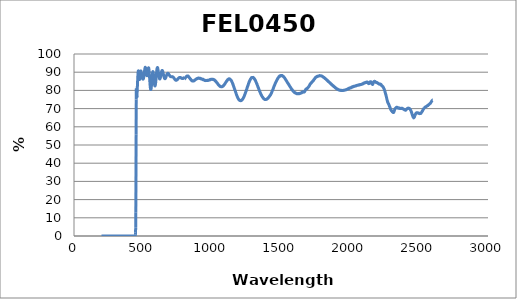
| Category | Series 0 |
|---|---|
| 2600.0 | 74.755 |
| 2599.0 | 74.749 |
| 2598.0 | 74.656 |
| 2597.0 | 74.498 |
| 2596.0 | 74.406 |
| 2595.0 | 74.374 |
| 2594.0 | 74.264 |
| 2593.0 | 74.176 |
| 2592.0 | 74.083 |
| 2591.0 | 73.98 |
| 2590.0 | 73.854 |
| 2589.0 | 73.661 |
| 2588.0 | 73.593 |
| 2587.0 | 73.488 |
| 2586.0 | 73.321 |
| 2585.0 | 73.196 |
| 2584.0 | 73.082 |
| 2583.0 | 72.942 |
| 2582.0 | 72.922 |
| 2581.0 | 72.822 |
| 2580.0 | 72.795 |
| 2579.0 | 72.671 |
| 2578.0 | 72.622 |
| 2577.0 | 72.607 |
| 2576.0 | 72.594 |
| 2575.0 | 72.407 |
| 2574.0 | 72.272 |
| 2573.0 | 72.362 |
| 2572.0 | 72.276 |
| 2571.0 | 72.215 |
| 2570.0 | 72.152 |
| 2569.0 | 72.054 |
| 2568.0 | 72.061 |
| 2567.0 | 71.957 |
| 2566.0 | 71.931 |
| 2565.0 | 71.707 |
| 2564.0 | 71.694 |
| 2563.0 | 71.696 |
| 2562.0 | 71.707 |
| 2561.0 | 71.598 |
| 2560.0 | 71.511 |
| 2559.0 | 71.585 |
| 2558.0 | 71.413 |
| 2557.0 | 71.343 |
| 2556.0 | 71.353 |
| 2555.0 | 71.277 |
| 2554.0 | 71.25 |
| 2553.0 | 71.181 |
| 2552.0 | 71.079 |
| 2551.0 | 70.973 |
| 2550.0 | 71.047 |
| 2549.0 | 70.967 |
| 2548.0 | 70.979 |
| 2547.0 | 70.916 |
| 2546.0 | 70.908 |
| 2545.0 | 70.795 |
| 2544.0 | 70.799 |
| 2543.0 | 70.642 |
| 2542.0 | 70.679 |
| 2541.0 | 70.577 |
| 2540.0 | 70.529 |
| 2539.0 | 70.413 |
| 2538.0 | 70.341 |
| 2537.0 | 70.189 |
| 2536.0 | 70.205 |
| 2535.0 | 69.985 |
| 2534.0 | 69.978 |
| 2533.0 | 69.738 |
| 2532.0 | 69.756 |
| 2531.0 | 69.515 |
| 2530.0 | 69.481 |
| 2529.0 | 69.311 |
| 2528.0 | 69.118 |
| 2527.0 | 68.999 |
| 2526.0 | 68.965 |
| 2525.0 | 68.724 |
| 2524.0 | 68.548 |
| 2523.0 | 68.515 |
| 2522.0 | 68.395 |
| 2521.0 | 68.179 |
| 2520.0 | 68.115 |
| 2519.0 | 67.998 |
| 2518.0 | 67.899 |
| 2517.0 | 67.712 |
| 2516.0 | 67.628 |
| 2515.0 | 67.537 |
| 2514.0 | 67.358 |
| 2513.0 | 67.433 |
| 2512.0 | 67.392 |
| 2511.0 | 67.32 |
| 2510.0 | 67.337 |
| 2509.0 | 67.252 |
| 2508.0 | 67.271 |
| 2507.0 | 67.277 |
| 2506.0 | 67.288 |
| 2505.0 | 67.379 |
| 2504.0 | 67.322 |
| 2503.0 | 67.26 |
| 2502.0 | 67.429 |
| 2501.0 | 67.272 |
| 2500.0 | 67.383 |
| 2499.0 | 67.527 |
| 2498.0 | 67.508 |
| 2497.0 | 67.52 |
| 2496.0 | 67.495 |
| 2495.0 | 67.543 |
| 2494.0 | 67.595 |
| 2493.0 | 67.564 |
| 2492.0 | 67.623 |
| 2491.0 | 67.637 |
| 2490.0 | 67.641 |
| 2489.0 | 67.749 |
| 2488.0 | 67.63 |
| 2487.0 | 67.627 |
| 2486.0 | 67.747 |
| 2485.0 | 67.633 |
| 2484.0 | 67.693 |
| 2483.0 | 67.718 |
| 2482.0 | 67.646 |
| 2481.0 | 67.661 |
| 2480.0 | 67.512 |
| 2479.0 | 67.44 |
| 2478.0 | 67.452 |
| 2477.0 | 67.17 |
| 2476.0 | 67.155 |
| 2475.0 | 66.958 |
| 2474.0 | 66.815 |
| 2473.0 | 66.7 |
| 2472.0 | 66.377 |
| 2471.0 | 66.359 |
| 2470.0 | 66.09 |
| 2469.0 | 65.917 |
| 2468.0 | 65.717 |
| 2467.0 | 65.388 |
| 2466.0 | 65.371 |
| 2465.0 | 65.183 |
| 2464.0 | 65.081 |
| 2463.0 | 65.059 |
| 2462.0 | 64.901 |
| 2461.0 | 64.993 |
| 2460.0 | 65.054 |
| 2459.0 | 65.156 |
| 2458.0 | 65.309 |
| 2457.0 | 65.414 |
| 2456.0 | 65.635 |
| 2455.0 | 65.851 |
| 2454.0 | 66.177 |
| 2453.0 | 66.309 |
| 2452.0 | 66.484 |
| 2451.0 | 66.699 |
| 2450.0 | 66.995 |
| 2449.0 | 67.122 |
| 2448.0 | 67.424 |
| 2447.0 | 67.72 |
| 2446.0 | 67.884 |
| 2445.0 | 68.169 |
| 2444.0 | 68.295 |
| 2443.0 | 68.603 |
| 2442.0 | 68.752 |
| 2441.0 | 69 |
| 2440.0 | 69.061 |
| 2439.0 | 69.208 |
| 2438.0 | 69.479 |
| 2437.0 | 69.523 |
| 2436.0 | 69.595 |
| 2435.0 | 69.714 |
| 2434.0 | 69.813 |
| 2433.0 | 69.838 |
| 2432.0 | 69.91 |
| 2431.0 | 70.049 |
| 2430.0 | 69.981 |
| 2429.0 | 70.113 |
| 2428.0 | 70.085 |
| 2427.0 | 70.196 |
| 2426.0 | 70.203 |
| 2425.0 | 70.263 |
| 2424.0 | 70.181 |
| 2423.0 | 70.242 |
| 2422.0 | 70.233 |
| 2421.0 | 70.258 |
| 2420.0 | 70.14 |
| 2419.0 | 70.237 |
| 2418.0 | 70.066 |
| 2417.0 | 70.086 |
| 2416.0 | 70.098 |
| 2415.0 | 69.969 |
| 2414.0 | 69.97 |
| 2413.0 | 69.926 |
| 2412.0 | 69.81 |
| 2411.0 | 69.734 |
| 2410.0 | 69.654 |
| 2409.0 | 69.625 |
| 2408.0 | 69.449 |
| 2407.0 | 69.462 |
| 2406.0 | 69.37 |
| 2405.0 | 69.187 |
| 2404.0 | 69.303 |
| 2403.0 | 69.095 |
| 2402.0 | 69.138 |
| 2401.0 | 69.136 |
| 2400.0 | 69.183 |
| 2399.0 | 69.25 |
| 2398.0 | 69.204 |
| 2397.0 | 69.389 |
| 2396.0 | 69.257 |
| 2395.0 | 69.421 |
| 2394.0 | 69.44 |
| 2393.0 | 69.432 |
| 2392.0 | 69.527 |
| 2391.0 | 69.543 |
| 2390.0 | 69.649 |
| 2389.0 | 69.65 |
| 2388.0 | 69.686 |
| 2387.0 | 69.682 |
| 2386.0 | 69.8 |
| 2385.0 | 69.857 |
| 2384.0 | 69.889 |
| 2383.0 | 69.938 |
| 2382.0 | 70.007 |
| 2381.0 | 70.028 |
| 2380.0 | 70.108 |
| 2379.0 | 70.104 |
| 2378.0 | 70.188 |
| 2377.0 | 70.172 |
| 2376.0 | 70.09 |
| 2375.0 | 70.108 |
| 2374.0 | 70.027 |
| 2373.0 | 70.086 |
| 2372.0 | 70.003 |
| 2371.0 | 70.128 |
| 2370.0 | 70.163 |
| 2369.0 | 70.093 |
| 2368.0 | 70.018 |
| 2367.0 | 69.994 |
| 2366.0 | 69.993 |
| 2365.0 | 69.988 |
| 2364.0 | 70.051 |
| 2363.0 | 70.045 |
| 2362.0 | 70.106 |
| 2361.0 | 70.18 |
| 2360.0 | 70.111 |
| 2359.0 | 70.311 |
| 2358.0 | 70.205 |
| 2357.0 | 70.284 |
| 2356.0 | 70.367 |
| 2355.0 | 70.283 |
| 2354.0 | 70.221 |
| 2353.0 | 70.174 |
| 2352.0 | 70.301 |
| 2351.0 | 70.194 |
| 2350.0 | 70.396 |
| 2349.0 | 70.335 |
| 2348.0 | 70.282 |
| 2347.0 | 70.538 |
| 2346.0 | 70.404 |
| 2345.0 | 70.471 |
| 2344.0 | 70.54 |
| 2343.0 | 70.521 |
| 2342.0 | 70.631 |
| 2341.0 | 70.717 |
| 2340.0 | 70.714 |
| 2339.0 | 70.717 |
| 2338.0 | 70.743 |
| 2337.0 | 70.621 |
| 2336.0 | 70.701 |
| 2335.0 | 70.615 |
| 2334.0 | 70.543 |
| 2333.0 | 70.448 |
| 2332.0 | 70.323 |
| 2331.0 | 70.313 |
| 2330.0 | 70.232 |
| 2329.0 | 70.186 |
| 2328.0 | 70.142 |
| 2327.0 | 69.962 |
| 2326.0 | 69.741 |
| 2325.0 | 69.664 |
| 2324.0 | 69.445 |
| 2323.0 | 69.228 |
| 2322.0 | 69.102 |
| 2321.0 | 68.815 |
| 2320.0 | 68.695 |
| 2319.0 | 68.382 |
| 2318.0 | 68.164 |
| 2317.0 | 68.036 |
| 2316.0 | 67.858 |
| 2315.0 | 67.826 |
| 2314.0 | 67.835 |
| 2313.0 | 67.855 |
| 2312.0 | 67.899 |
| 2311.0 | 68.007 |
| 2310.0 | 68.085 |
| 2309.0 | 68.106 |
| 2308.0 | 68.243 |
| 2307.0 | 68.299 |
| 2306.0 | 68.287 |
| 2305.0 | 68.501 |
| 2304.0 | 68.537 |
| 2303.0 | 68.743 |
| 2302.0 | 68.66 |
| 2301.0 | 68.807 |
| 2300.0 | 68.859 |
| 2299.0 | 69.02 |
| 2298.0 | 69.212 |
| 2297.0 | 69.233 |
| 2296.0 | 69.418 |
| 2295.0 | 69.637 |
| 2294.0 | 69.842 |
| 2293.0 | 69.965 |
| 2292.0 | 70.185 |
| 2291.0 | 70.348 |
| 2290.0 | 70.681 |
| 2289.0 | 70.741 |
| 2288.0 | 70.956 |
| 2287.0 | 71.094 |
| 2286.0 | 71.269 |
| 2285.0 | 71.465 |
| 2284.0 | 71.776 |
| 2283.0 | 72.001 |
| 2282.0 | 72.129 |
| 2281.0 | 72.236 |
| 2280.0 | 72.541 |
| 2279.0 | 72.664 |
| 2278.0 | 72.782 |
| 2277.0 | 72.884 |
| 2276.0 | 73.109 |
| 2275.0 | 73.233 |
| 2274.0 | 73.336 |
| 2273.0 | 73.638 |
| 2272.0 | 73.79 |
| 2271.0 | 74.15 |
| 2270.0 | 74.355 |
| 2269.0 | 74.669 |
| 2268.0 | 74.959 |
| 2267.0 | 75.339 |
| 2266.0 | 75.659 |
| 2265.0 | 76.037 |
| 2264.0 | 76.254 |
| 2263.0 | 76.634 |
| 2262.0 | 76.865 |
| 2261.0 | 77.267 |
| 2260.0 | 77.59 |
| 2259.0 | 77.757 |
| 2258.0 | 78.043 |
| 2257.0 | 78.349 |
| 2256.0 | 78.631 |
| 2255.0 | 78.95 |
| 2254.0 | 79.125 |
| 2253.0 | 79.475 |
| 2252.0 | 79.814 |
| 2251.0 | 79.901 |
| 2250.0 | 80.174 |
| 2249.0 | 80.365 |
| 2248.0 | 80.627 |
| 2247.0 | 80.784 |
| 2246.0 | 81.003 |
| 2245.0 | 81.081 |
| 2244.0 | 81.311 |
| 2243.0 | 81.445 |
| 2242.0 | 81.663 |
| 2241.0 | 81.74 |
| 2240.0 | 81.759 |
| 2239.0 | 81.923 |
| 2238.0 | 82.071 |
| 2237.0 | 82.157 |
| 2236.0 | 82.243 |
| 2235.0 | 82.302 |
| 2234.0 | 82.352 |
| 2233.0 | 82.372 |
| 2232.0 | 82.486 |
| 2231.0 | 82.595 |
| 2230.0 | 82.629 |
| 2229.0 | 82.601 |
| 2228.0 | 82.881 |
| 2227.0 | 83.037 |
| 2226.0 | 83.019 |
| 2225.0 | 83.121 |
| 2224.0 | 83.245 |
| 2223.0 | 83.341 |
| 2222.0 | 83.322 |
| 2221.0 | 83.265 |
| 2220.0 | 83.471 |
| 2219.0 | 83.512 |
| 2218.0 | 83.517 |
| 2217.0 | 83.585 |
| 2216.0 | 83.54 |
| 2215.0 | 83.459 |
| 2214.0 | 83.494 |
| 2213.0 | 83.494 |
| 2212.0 | 83.431 |
| 2211.0 | 83.551 |
| 2210.0 | 83.561 |
| 2209.0 | 83.532 |
| 2208.0 | 83.726 |
| 2207.0 | 83.625 |
| 2206.0 | 83.779 |
| 2205.0 | 83.708 |
| 2204.0 | 83.843 |
| 2203.0 | 83.839 |
| 2202.0 | 83.952 |
| 2201.0 | 83.959 |
| 2200.0 | 84.105 |
| 2199.0 | 84.125 |
| 2198.0 | 84.137 |
| 2197.0 | 84.186 |
| 2196.0 | 84.29 |
| 2195.0 | 84.337 |
| 2194.0 | 84.29 |
| 2193.0 | 84.339 |
| 2192.0 | 84.335 |
| 2191.0 | 84.457 |
| 2190.0 | 84.315 |
| 2189.0 | 84.433 |
| 2188.0 | 84.471 |
| 2187.0 | 84.555 |
| 2186.0 | 84.612 |
| 2185.0 | 84.621 |
| 2184.0 | 84.708 |
| 2183.0 | 84.813 |
| 2182.0 | 84.899 |
| 2181.0 | 84.837 |
| 2180.0 | 84.827 |
| 2179.0 | 84.921 |
| 2178.0 | 84.823 |
| 2177.0 | 85.047 |
| 2176.0 | 84.836 |
| 2175.0 | 84.84 |
| 2174.0 | 84.827 |
| 2173.0 | 84.818 |
| 2172.0 | 84.575 |
| 2171.0 | 84.485 |
| 2170.0 | 84.274 |
| 2169.0 | 84.099 |
| 2168.0 | 83.915 |
| 2167.0 | 83.815 |
| 2166.0 | 83.557 |
| 2165.0 | 83.455 |
| 2164.0 | 83.278 |
| 2163.0 | 83.305 |
| 2162.0 | 83.351 |
| 2161.0 | 83.425 |
| 2160.0 | 83.529 |
| 2159.0 | 83.554 |
| 2158.0 | 83.771 |
| 2157.0 | 83.87 |
| 2156.0 | 84.071 |
| 2155.0 | 84.295 |
| 2154.0 | 84.494 |
| 2153.0 | 84.502 |
| 2152.0 | 84.582 |
| 2151.0 | 84.578 |
| 2150.0 | 84.79 |
| 2149.0 | 84.702 |
| 2148.0 | 84.785 |
| 2147.0 | 84.75 |
| 2146.0 | 84.661 |
| 2145.0 | 84.52 |
| 2144.0 | 84.465 |
| 2143.0 | 84.531 |
| 2142.0 | 84.253 |
| 2141.0 | 84.13 |
| 2140.0 | 84.026 |
| 2139.0 | 83.894 |
| 2138.0 | 83.887 |
| 2137.0 | 83.731 |
| 2136.0 | 83.744 |
| 2135.0 | 83.712 |
| 2134.0 | 83.795 |
| 2133.0 | 83.803 |
| 2132.0 | 83.907 |
| 2131.0 | 84.041 |
| 2130.0 | 84.076 |
| 2129.0 | 84.18 |
| 2128.0 | 84.284 |
| 2127.0 | 84.287 |
| 2126.0 | 84.484 |
| 2125.0 | 84.62 |
| 2124.0 | 84.526 |
| 2123.0 | 84.461 |
| 2122.0 | 84.513 |
| 2121.0 | 84.593 |
| 2120.0 | 84.555 |
| 2119.0 | 84.378 |
| 2118.0 | 84.495 |
| 2117.0 | 84.422 |
| 2116.0 | 84.381 |
| 2115.0 | 84.437 |
| 2114.0 | 84.364 |
| 2113.0 | 84.407 |
| 2112.0 | 84.314 |
| 2111.0 | 84.229 |
| 2110.0 | 84.236 |
| 2109.0 | 84.193 |
| 2108.0 | 84.284 |
| 2107.0 | 84.175 |
| 2106.0 | 84.075 |
| 2105.0 | 84.096 |
| 2104.0 | 84.132 |
| 2103.0 | 84.06 |
| 2102.0 | 83.977 |
| 2101.0 | 84.093 |
| 2100.0 | 83.89 |
| 2099.0 | 83.878 |
| 2098.0 | 83.964 |
| 2097.0 | 83.722 |
| 2096.0 | 83.781 |
| 2095.0 | 83.788 |
| 2094.0 | 83.732 |
| 2093.0 | 83.574 |
| 2092.0 | 83.59 |
| 2091.0 | 83.563 |
| 2090.0 | 83.555 |
| 2089.0 | 83.582 |
| 2088.0 | 83.466 |
| 2087.0 | 83.507 |
| 2086.0 | 83.434 |
| 2085.0 | 83.395 |
| 2084.0 | 83.309 |
| 2083.0 | 83.335 |
| 2082.0 | 83.265 |
| 2081.0 | 83.278 |
| 2080.0 | 83.26 |
| 2079.0 | 83.201 |
| 2078.0 | 83.278 |
| 2077.0 | 83.171 |
| 2076.0 | 83.145 |
| 2075.0 | 83.156 |
| 2074.0 | 83.195 |
| 2073.0 | 83.197 |
| 2072.0 | 83.198 |
| 2071.0 | 83.089 |
| 2070.0 | 83.157 |
| 2069.0 | 83.001 |
| 2068.0 | 82.968 |
| 2067.0 | 83.061 |
| 2066.0 | 82.968 |
| 2065.0 | 83.066 |
| 2064.0 | 83.009 |
| 2063.0 | 83.025 |
| 2062.0 | 82.908 |
| 2061.0 | 82.932 |
| 2060.0 | 82.871 |
| 2059.0 | 82.899 |
| 2058.0 | 82.917 |
| 2057.0 | 82.896 |
| 2056.0 | 82.829 |
| 2055.0 | 82.783 |
| 2054.0 | 82.82 |
| 2053.0 | 82.753 |
| 2052.0 | 82.732 |
| 2051.0 | 82.768 |
| 2050.0 | 82.693 |
| 2049.0 | 82.608 |
| 2048.0 | 82.687 |
| 2047.0 | 82.68 |
| 2046.0 | 82.623 |
| 2045.0 | 82.517 |
| 2044.0 | 82.481 |
| 2043.0 | 82.551 |
| 2042.0 | 82.571 |
| 2041.0 | 82.606 |
| 2040.0 | 82.539 |
| 2039.0 | 82.399 |
| 2038.0 | 82.395 |
| 2037.0 | 82.437 |
| 2036.0 | 82.381 |
| 2035.0 | 82.342 |
| 2034.0 | 82.353 |
| 2033.0 | 82.329 |
| 2032.0 | 82.222 |
| 2031.0 | 82.243 |
| 2030.0 | 82.211 |
| 2029.0 | 82.18 |
| 2028.0 | 82.285 |
| 2027.0 | 82.192 |
| 2026.0 | 82.113 |
| 2025.0 | 82.231 |
| 2024.0 | 82.118 |
| 2023.0 | 82.048 |
| 2022.0 | 81.983 |
| 2021.0 | 81.987 |
| 2020.0 | 81.879 |
| 2019.0 | 81.987 |
| 2018.0 | 81.972 |
| 2017.0 | 81.773 |
| 2016.0 | 81.942 |
| 2015.0 | 81.796 |
| 2014.0 | 81.735 |
| 2013.0 | 81.81 |
| 2012.0 | 81.741 |
| 2011.0 | 81.752 |
| 2010.0 | 81.627 |
| 2009.0 | 81.664 |
| 2008.0 | 81.467 |
| 2007.0 | 81.562 |
| 2006.0 | 81.518 |
| 2005.0 | 81.442 |
| 2004.0 | 81.493 |
| 2003.0 | 81.448 |
| 2002.0 | 81.404 |
| 2001.0 | 81.37 |
| 2000.0 | 81.348 |
| 1999.0 | 81.201 |
| 1998.0 | 81.298 |
| 1997.0 | 81.306 |
| 1996.0 | 81.171 |
| 1995.0 | 81.073 |
| 1994.0 | 81.152 |
| 1993.0 | 81.23 |
| 1992.0 | 81.087 |
| 1991.0 | 81.121 |
| 1990.0 | 81.1 |
| 1989.0 | 80.907 |
| 1988.0 | 80.917 |
| 1987.0 | 80.968 |
| 1986.0 | 80.82 |
| 1985.0 | 80.872 |
| 1984.0 | 80.853 |
| 1983.0 | 80.736 |
| 1982.0 | 80.655 |
| 1981.0 | 80.652 |
| 1980.0 | 80.658 |
| 1979.0 | 80.609 |
| 1978.0 | 80.531 |
| 1977.0 | 80.59 |
| 1976.0 | 80.463 |
| 1975.0 | 80.538 |
| 1974.0 | 80.547 |
| 1973.0 | 80.439 |
| 1972.0 | 80.399 |
| 1971.0 | 80.41 |
| 1970.0 | 80.387 |
| 1969.0 | 80.242 |
| 1968.0 | 80.285 |
| 1967.0 | 80.28 |
| 1966.0 | 80.285 |
| 1965.0 | 80.231 |
| 1964.0 | 80.243 |
| 1963.0 | 80.163 |
| 1962.0 | 80.186 |
| 1961.0 | 80.144 |
| 1960.0 | 80.072 |
| 1959.0 | 80.12 |
| 1958.0 | 80.118 |
| 1957.0 | 80.086 |
| 1956.0 | 80.051 |
| 1955.0 | 80.099 |
| 1954.0 | 79.985 |
| 1953.0 | 80.094 |
| 1952.0 | 79.963 |
| 1951.0 | 80.029 |
| 1950.0 | 79.969 |
| 1949.0 | 79.943 |
| 1948.0 | 79.947 |
| 1947.0 | 79.958 |
| 1946.0 | 79.944 |
| 1945.0 | 80.031 |
| 1944.0 | 79.946 |
| 1943.0 | 80.01 |
| 1942.0 | 79.943 |
| 1941.0 | 79.979 |
| 1940.0 | 79.96 |
| 1939.0 | 79.967 |
| 1938.0 | 80.018 |
| 1937.0 | 80.064 |
| 1936.0 | 80 |
| 1935.0 | 79.975 |
| 1934.0 | 79.9 |
| 1933.0 | 80.013 |
| 1932.0 | 79.995 |
| 1931.0 | 80.012 |
| 1930.0 | 80.043 |
| 1929.0 | 80.053 |
| 1928.0 | 80.109 |
| 1927.0 | 80.167 |
| 1926.0 | 80.091 |
| 1925.0 | 80.172 |
| 1924.0 | 80.231 |
| 1923.0 | 80.164 |
| 1922.0 | 80.14 |
| 1921.0 | 80.198 |
| 1920.0 | 80.261 |
| 1919.0 | 80.3 |
| 1918.0 | 80.27 |
| 1917.0 | 80.362 |
| 1916.0 | 80.417 |
| 1915.0 | 80.421 |
| 1914.0 | 80.446 |
| 1913.0 | 80.481 |
| 1912.0 | 80.472 |
| 1911.0 | 80.713 |
| 1910.0 | 80.641 |
| 1909.0 | 80.691 |
| 1908.0 | 80.74 |
| 1907.0 | 80.695 |
| 1906.0 | 80.766 |
| 1905.0 | 80.933 |
| 1904.0 | 80.853 |
| 1903.0 | 80.998 |
| 1902.0 | 80.937 |
| 1901.0 | 81.012 |
| 1900.0 | 81.122 |
| 1899.0 | 81.075 |
| 1898.0 | 81.193 |
| 1897.0 | 81.362 |
| 1896.0 | 81.402 |
| 1895.0 | 81.456 |
| 1894.0 | 81.398 |
| 1893.0 | 81.572 |
| 1892.0 | 81.49 |
| 1891.0 | 81.718 |
| 1890.0 | 81.808 |
| 1889.0 | 81.878 |
| 1888.0 | 81.839 |
| 1887.0 | 81.951 |
| 1886.0 | 81.959 |
| 1885.0 | 82.034 |
| 1884.0 | 82.022 |
| 1883.0 | 82.2 |
| 1882.0 | 82.367 |
| 1881.0 | 82.283 |
| 1880.0 | 82.363 |
| 1879.0 | 82.374 |
| 1878.0 | 82.445 |
| 1877.0 | 82.581 |
| 1876.0 | 82.713 |
| 1875.0 | 82.696 |
| 1874.0 | 82.766 |
| 1873.0 | 82.823 |
| 1872.0 | 82.867 |
| 1871.0 | 82.881 |
| 1870.0 | 83.117 |
| 1869.0 | 83.086 |
| 1868.0 | 83.201 |
| 1867.0 | 83.202 |
| 1866.0 | 83.415 |
| 1865.0 | 83.463 |
| 1864.0 | 83.373 |
| 1863.0 | 83.53 |
| 1862.0 | 83.577 |
| 1861.0 | 83.592 |
| 1860.0 | 83.665 |
| 1859.0 | 83.872 |
| 1858.0 | 83.9 |
| 1857.0 | 84.018 |
| 1856.0 | 84.128 |
| 1855.0 | 84.049 |
| 1854.0 | 84.145 |
| 1853.0 | 84.211 |
| 1852.0 | 84.329 |
| 1851.0 | 84.425 |
| 1850.0 | 84.41 |
| 1849.0 | 84.577 |
| 1848.0 | 84.533 |
| 1847.0 | 84.609 |
| 1846.0 | 84.75 |
| 1845.0 | 84.806 |
| 1844.0 | 84.871 |
| 1843.0 | 84.822 |
| 1842.0 | 84.966 |
| 1841.0 | 84.96 |
| 1840.0 | 85.194 |
| 1839.0 | 85.192 |
| 1838.0 | 85.293 |
| 1837.0 | 85.507 |
| 1836.0 | 85.416 |
| 1835.0 | 85.566 |
| 1834.0 | 85.606 |
| 1833.0 | 85.631 |
| 1832.0 | 85.735 |
| 1831.0 | 85.742 |
| 1830.0 | 85.946 |
| 1829.0 | 85.901 |
| 1828.0 | 86.043 |
| 1827.0 | 86.026 |
| 1826.0 | 86.11 |
| 1825.0 | 86.217 |
| 1824.0 | 86.315 |
| 1823.0 | 86.416 |
| 1822.0 | 86.331 |
| 1821.0 | 86.49 |
| 1820.0 | 86.554 |
| 1819.0 | 86.662 |
| 1818.0 | 86.697 |
| 1817.0 | 86.675 |
| 1816.0 | 86.852 |
| 1815.0 | 86.828 |
| 1814.0 | 86.869 |
| 1813.0 | 86.979 |
| 1812.0 | 86.99 |
| 1811.0 | 87.052 |
| 1810.0 | 87.183 |
| 1809.0 | 87.197 |
| 1808.0 | 87.261 |
| 1807.0 | 87.341 |
| 1806.0 | 87.42 |
| 1805.0 | 87.432 |
| 1804.0 | 87.384 |
| 1803.0 | 87.475 |
| 1802.0 | 87.586 |
| 1801.0 | 87.584 |
| 1800.0 | 87.746 |
| 1799.0 | 87.712 |
| 1798.0 | 87.781 |
| 1797.0 | 87.845 |
| 1796.0 | 87.801 |
| 1795.0 | 87.86 |
| 1794.0 | 87.939 |
| 1793.0 | 87.869 |
| 1792.0 | 87.936 |
| 1791.0 | 87.979 |
| 1790.0 | 88.037 |
| 1789.0 | 88.043 |
| 1788.0 | 87.984 |
| 1787.0 | 88.052 |
| 1786.0 | 88.069 |
| 1785.0 | 88.048 |
| 1784.0 | 88.093 |
| 1783.0 | 88.059 |
| 1782.0 | 88.073 |
| 1781.0 | 88.114 |
| 1780.0 | 88.151 |
| 1779.0 | 88.13 |
| 1778.0 | 87.996 |
| 1777.0 | 88.011 |
| 1776.0 | 87.931 |
| 1775.0 | 87.889 |
| 1774.0 | 87.839 |
| 1773.0 | 87.899 |
| 1772.0 | 87.925 |
| 1771.0 | 87.911 |
| 1770.0 | 87.82 |
| 1769.0 | 87.847 |
| 1768.0 | 87.76 |
| 1767.0 | 87.779 |
| 1766.0 | 87.819 |
| 1765.0 | 87.78 |
| 1764.0 | 87.758 |
| 1763.0 | 87.646 |
| 1762.0 | 87.747 |
| 1761.0 | 87.616 |
| 1760.0 | 87.484 |
| 1759.0 | 87.56 |
| 1758.0 | 87.525 |
| 1757.0 | 87.462 |
| 1756.0 | 87.358 |
| 1755.0 | 87.385 |
| 1754.0 | 87.33 |
| 1753.0 | 87.306 |
| 1752.0 | 87.251 |
| 1751.0 | 87.095 |
| 1750.0 | 87.009 |
| 1749.0 | 86.95 |
| 1748.0 | 86.866 |
| 1747.0 | 86.803 |
| 1746.0 | 86.607 |
| 1745.0 | 86.522 |
| 1744.0 | 86.384 |
| 1743.0 | 86.414 |
| 1742.0 | 86.274 |
| 1741.0 | 86.157 |
| 1740.0 | 86.04 |
| 1739.0 | 85.968 |
| 1738.0 | 85.847 |
| 1737.0 | 85.676 |
| 1736.0 | 85.651 |
| 1735.0 | 85.576 |
| 1734.0 | 85.313 |
| 1733.0 | 85.321 |
| 1732.0 | 85.268 |
| 1731.0 | 85.223 |
| 1730.0 | 85.05 |
| 1729.0 | 85.026 |
| 1728.0 | 84.816 |
| 1727.0 | 84.814 |
| 1726.0 | 84.701 |
| 1725.0 | 84.615 |
| 1724.0 | 84.555 |
| 1723.0 | 84.454 |
| 1722.0 | 84.48 |
| 1721.0 | 84.228 |
| 1720.0 | 84.202 |
| 1719.0 | 84.051 |
| 1718.0 | 84.068 |
| 1717.0 | 83.886 |
| 1716.0 | 83.738 |
| 1715.0 | 83.759 |
| 1714.0 | 83.76 |
| 1713.0 | 83.596 |
| 1712.0 | 83.489 |
| 1711.0 | 83.405 |
| 1710.0 | 83.272 |
| 1709.0 | 83.097 |
| 1708.0 | 83.005 |
| 1707.0 | 82.77 |
| 1706.0 | 82.725 |
| 1705.0 | 82.577 |
| 1704.0 | 82.439 |
| 1703.0 | 82.274 |
| 1702.0 | 82.176 |
| 1701.0 | 82.1 |
| 1700.0 | 81.962 |
| 1699.0 | 81.837 |
| 1698.0 | 81.763 |
| 1697.0 | 81.646 |
| 1696.0 | 81.691 |
| 1695.0 | 81.537 |
| 1694.0 | 81.536 |
| 1693.0 | 81.417 |
| 1692.0 | 81.311 |
| 1691.0 | 81.124 |
| 1690.0 | 81.198 |
| 1689.0 | 81.017 |
| 1688.0 | 81.032 |
| 1687.0 | 80.847 |
| 1686.0 | 80.879 |
| 1685.0 | 80.937 |
| 1684.0 | 80.833 |
| 1683.0 | 80.683 |
| 1682.0 | 80.737 |
| 1681.0 | 80.643 |
| 1680.0 | 80.642 |
| 1679.0 | 80.411 |
| 1678.0 | 80.305 |
| 1677.0 | 80.22 |
| 1676.0 | 80.086 |
| 1675.0 | 79.897 |
| 1674.0 | 79.751 |
| 1673.0 | 79.569 |
| 1672.0 | 79.523 |
| 1671.0 | 79.266 |
| 1670.0 | 79.178 |
| 1669.0 | 79.096 |
| 1668.0 | 79.117 |
| 1667.0 | 79.111 |
| 1666.0 | 79.079 |
| 1665.0 | 79.047 |
| 1664.0 | 79.152 |
| 1663.0 | 79.128 |
| 1662.0 | 79.274 |
| 1661.0 | 79.189 |
| 1660.0 | 79.164 |
| 1659.0 | 79.177 |
| 1658.0 | 79.104 |
| 1657.0 | 79.106 |
| 1656.0 | 79.093 |
| 1655.0 | 79.071 |
| 1654.0 | 79.082 |
| 1653.0 | 78.929 |
| 1652.0 | 78.917 |
| 1651.0 | 78.786 |
| 1650.0 | 78.714 |
| 1649.0 | 78.574 |
| 1648.0 | 78.636 |
| 1647.0 | 78.631 |
| 1646.0 | 78.588 |
| 1645.0 | 78.525 |
| 1644.0 | 78.495 |
| 1643.0 | 78.57 |
| 1642.0 | 78.54 |
| 1641.0 | 78.516 |
| 1640.0 | 78.497 |
| 1639.0 | 78.376 |
| 1638.0 | 78.291 |
| 1637.0 | 78.359 |
| 1636.0 | 78.327 |
| 1635.0 | 78.22 |
| 1634.0 | 78.257 |
| 1633.0 | 78.259 |
| 1632.0 | 78.207 |
| 1631.0 | 78.25 |
| 1630.0 | 78.277 |
| 1629.0 | 78.182 |
| 1628.0 | 78.217 |
| 1627.0 | 78.304 |
| 1626.0 | 78.13 |
| 1625.0 | 78.235 |
| 1624.0 | 78.154 |
| 1623.0 | 78.176 |
| 1622.0 | 78.167 |
| 1621.0 | 78.128 |
| 1620.0 | 78.244 |
| 1619.0 | 78.175 |
| 1618.0 | 78.144 |
| 1617.0 | 78.196 |
| 1616.0 | 78.239 |
| 1615.0 | 78.25 |
| 1614.0 | 78.213 |
| 1613.0 | 78.35 |
| 1612.0 | 78.284 |
| 1611.0 | 78.341 |
| 1610.0 | 78.417 |
| 1609.0 | 78.464 |
| 1608.0 | 78.478 |
| 1607.0 | 78.549 |
| 1606.0 | 78.468 |
| 1605.0 | 78.524 |
| 1604.0 | 78.557 |
| 1603.0 | 78.613 |
| 1602.0 | 78.693 |
| 1601.0 | 78.706 |
| 1600.0 | 78.836 |
| 1599.0 | 78.86 |
| 1598.0 | 78.951 |
| 1597.0 | 78.886 |
| 1596.0 | 79.094 |
| 1595.0 | 79.156 |
| 1594.0 | 79.192 |
| 1593.0 | 79.166 |
| 1592.0 | 79.374 |
| 1591.0 | 79.392 |
| 1590.0 | 79.488 |
| 1589.0 | 79.561 |
| 1588.0 | 79.678 |
| 1587.0 | 79.689 |
| 1586.0 | 79.766 |
| 1585.0 | 79.913 |
| 1584.0 | 80.05 |
| 1583.0 | 80.053 |
| 1582.0 | 80.127 |
| 1581.0 | 80.378 |
| 1580.0 | 80.386 |
| 1579.0 | 80.503 |
| 1578.0 | 80.594 |
| 1577.0 | 80.696 |
| 1576.0 | 80.829 |
| 1575.0 | 80.86 |
| 1574.0 | 81.058 |
| 1573.0 | 81.187 |
| 1572.0 | 81.295 |
| 1571.0 | 81.463 |
| 1570.0 | 81.543 |
| 1569.0 | 81.694 |
| 1568.0 | 81.776 |
| 1567.0 | 81.932 |
| 1566.0 | 82.025 |
| 1565.0 | 82.196 |
| 1564.0 | 82.184 |
| 1563.0 | 82.374 |
| 1562.0 | 82.473 |
| 1561.0 | 82.549 |
| 1560.0 | 82.756 |
| 1559.0 | 82.925 |
| 1558.0 | 83.064 |
| 1557.0 | 83.143 |
| 1556.0 | 83.282 |
| 1555.0 | 83.368 |
| 1554.0 | 83.541 |
| 1553.0 | 83.684 |
| 1552.0 | 83.712 |
| 1551.0 | 83.792 |
| 1550.0 | 83.969 |
| 1549.0 | 84.028 |
| 1548.0 | 84.212 |
| 1547.0 | 84.297 |
| 1546.0 | 84.416 |
| 1545.0 | 84.557 |
| 1544.0 | 84.635 |
| 1543.0 | 84.729 |
| 1542.0 | 84.972 |
| 1541.0 | 85.064 |
| 1540.0 | 85.159 |
| 1539.0 | 85.344 |
| 1538.0 | 85.44 |
| 1537.0 | 85.583 |
| 1536.0 | 85.614 |
| 1535.0 | 85.772 |
| 1534.0 | 85.849 |
| 1533.0 | 85.993 |
| 1532.0 | 86.137 |
| 1531.0 | 86.25 |
| 1530.0 | 86.398 |
| 1529.0 | 86.485 |
| 1528.0 | 86.589 |
| 1527.0 | 86.83 |
| 1526.0 | 86.905 |
| 1525.0 | 86.943 |
| 1524.0 | 86.98 |
| 1523.0 | 87.106 |
| 1522.0 | 87.185 |
| 1521.0 | 87.329 |
| 1520.0 | 87.432 |
| 1519.0 | 87.491 |
| 1518.0 | 87.497 |
| 1517.0 | 87.59 |
| 1516.0 | 87.715 |
| 1515.0 | 87.859 |
| 1514.0 | 87.881 |
| 1513.0 | 87.904 |
| 1512.0 | 87.833 |
| 1511.0 | 88.002 |
| 1510.0 | 87.977 |
| 1509.0 | 88.126 |
| 1508.0 | 88.025 |
| 1507.0 | 88.233 |
| 1506.0 | 88.2 |
| 1505.0 | 88.171 |
| 1504.0 | 88.138 |
| 1503.0 | 88.247 |
| 1502.0 | 88.145 |
| 1501.0 | 88.186 |
| 1500.0 | 88.189 |
| 1499.0 | 88.177 |
| 1498.0 | 88.104 |
| 1497.0 | 88.053 |
| 1496.0 | 88.121 |
| 1495.0 | 88.01 |
| 1494.0 | 88.086 |
| 1493.0 | 87.971 |
| 1492.0 | 87.722 |
| 1491.0 | 87.873 |
| 1490.0 | 87.719 |
| 1489.0 | 87.864 |
| 1488.0 | 87.719 |
| 1487.0 | 87.644 |
| 1486.0 | 87.499 |
| 1485.0 | 87.566 |
| 1484.0 | 87.409 |
| 1483.0 | 87.251 |
| 1482.0 | 87.15 |
| 1481.0 | 87.078 |
| 1480.0 | 86.908 |
| 1479.0 | 86.823 |
| 1478.0 | 86.701 |
| 1477.0 | 86.636 |
| 1476.0 | 86.472 |
| 1475.0 | 86.248 |
| 1474.0 | 86.219 |
| 1473.0 | 86.036 |
| 1472.0 | 86.003 |
| 1471.0 | 85.83 |
| 1470.0 | 85.63 |
| 1469.0 | 85.533 |
| 1468.0 | 85.29 |
| 1467.0 | 85.227 |
| 1466.0 | 84.982 |
| 1465.0 | 84.91 |
| 1464.0 | 84.789 |
| 1463.0 | 84.586 |
| 1462.0 | 84.435 |
| 1461.0 | 84.136 |
| 1460.0 | 84.095 |
| 1459.0 | 83.96 |
| 1458.0 | 83.709 |
| 1457.0 | 83.473 |
| 1456.0 | 83.386 |
| 1455.0 | 83.119 |
| 1454.0 | 83.041 |
| 1453.0 | 82.743 |
| 1452.0 | 82.605 |
| 1451.0 | 82.445 |
| 1450.0 | 82.244 |
| 1449.0 | 82.126 |
| 1448.0 | 81.804 |
| 1447.0 | 81.797 |
| 1446.0 | 81.424 |
| 1445.0 | 81.273 |
| 1444.0 | 81.152 |
| 1443.0 | 80.849 |
| 1442.0 | 80.624 |
| 1441.0 | 80.379 |
| 1440.0 | 80.233 |
| 1439.0 | 80.148 |
| 1438.0 | 79.893 |
| 1437.0 | 79.78 |
| 1436.0 | 79.541 |
| 1435.0 | 79.329 |
| 1434.0 | 79.219 |
| 1433.0 | 78.979 |
| 1432.0 | 78.772 |
| 1431.0 | 78.57 |
| 1430.0 | 78.392 |
| 1429.0 | 78.323 |
| 1428.0 | 78.137 |
| 1427.0 | 77.974 |
| 1426.0 | 77.801 |
| 1425.0 | 77.736 |
| 1424.0 | 77.546 |
| 1423.0 | 77.456 |
| 1422.0 | 77.397 |
| 1421.0 | 77.267 |
| 1420.0 | 77.169 |
| 1419.0 | 77.041 |
| 1418.0 | 76.849 |
| 1417.0 | 76.808 |
| 1416.0 | 76.744 |
| 1415.0 | 76.59 |
| 1414.0 | 76.496 |
| 1413.0 | 76.41 |
| 1412.0 | 76.26 |
| 1411.0 | 76.202 |
| 1410.0 | 76.205 |
| 1409.0 | 75.99 |
| 1408.0 | 75.983 |
| 1407.0 | 75.818 |
| 1406.0 | 75.731 |
| 1405.0 | 75.653 |
| 1404.0 | 75.58 |
| 1403.0 | 75.594 |
| 1402.0 | 75.551 |
| 1401.0 | 75.419 |
| 1400.0 | 75.361 |
| 1399.0 | 75.321 |
| 1398.0 | 75.279 |
| 1397.0 | 75.178 |
| 1396.0 | 75.125 |
| 1395.0 | 75.091 |
| 1394.0 | 75.059 |
| 1393.0 | 75.039 |
| 1392.0 | 75.024 |
| 1391.0 | 75.054 |
| 1390.0 | 74.973 |
| 1389.0 | 74.992 |
| 1388.0 | 74.972 |
| 1387.0 | 75.04 |
| 1386.0 | 75.018 |
| 1385.0 | 74.973 |
| 1384.0 | 75.091 |
| 1383.0 | 74.951 |
| 1382.0 | 75.107 |
| 1381.0 | 75.135 |
| 1380.0 | 75.193 |
| 1379.0 | 75.25 |
| 1378.0 | 75.258 |
| 1377.0 | 75.405 |
| 1376.0 | 75.378 |
| 1375.0 | 75.428 |
| 1374.0 | 75.564 |
| 1373.0 | 75.608 |
| 1372.0 | 75.736 |
| 1371.0 | 75.828 |
| 1370.0 | 75.897 |
| 1369.0 | 76.073 |
| 1368.0 | 76.062 |
| 1367.0 | 76.239 |
| 1366.0 | 76.385 |
| 1365.0 | 76.387 |
| 1364.0 | 76.527 |
| 1363.0 | 76.685 |
| 1362.0 | 76.754 |
| 1361.0 | 76.903 |
| 1360.0 | 77.169 |
| 1359.0 | 77.328 |
| 1358.0 | 77.337 |
| 1357.0 | 77.552 |
| 1356.0 | 77.665 |
| 1355.0 | 77.886 |
| 1354.0 | 77.978 |
| 1353.0 | 78.156 |
| 1352.0 | 78.333 |
| 1351.0 | 78.463 |
| 1350.0 | 78.715 |
| 1349.0 | 78.79 |
| 1348.0 | 79.073 |
| 1347.0 | 79.271 |
| 1346.0 | 79.49 |
| 1345.0 | 79.723 |
| 1344.0 | 79.83 |
| 1343.0 | 79.972 |
| 1342.0 | 80.119 |
| 1341.0 | 80.434 |
| 1340.0 | 80.552 |
| 1339.0 | 80.739 |
| 1338.0 | 80.984 |
| 1337.0 | 81.182 |
| 1336.0 | 81.471 |
| 1335.0 | 81.597 |
| 1334.0 | 81.804 |
| 1333.0 | 81.882 |
| 1332.0 | 82.149 |
| 1331.0 | 82.324 |
| 1330.0 | 82.649 |
| 1329.0 | 82.81 |
| 1328.0 | 82.961 |
| 1327.0 | 83.1 |
| 1326.0 | 83.394 |
| 1325.0 | 83.647 |
| 1324.0 | 83.685 |
| 1323.0 | 83.987 |
| 1322.0 | 84.054 |
| 1321.0 | 84.292 |
| 1320.0 | 84.456 |
| 1319.0 | 84.665 |
| 1318.0 | 84.804 |
| 1317.0 | 85.012 |
| 1316.0 | 85.23 |
| 1315.0 | 85.384 |
| 1314.0 | 85.531 |
| 1313.0 | 85.577 |
| 1312.0 | 85.834 |
| 1311.0 | 85.918 |
| 1310.0 | 86.089 |
| 1309.0 | 86.11 |
| 1308.0 | 86.277 |
| 1307.0 | 86.355 |
| 1306.0 | 86.502 |
| 1305.0 | 86.543 |
| 1304.0 | 86.711 |
| 1303.0 | 86.726 |
| 1302.0 | 86.795 |
| 1301.0 | 86.986 |
| 1300.0 | 87.027 |
| 1299.0 | 87.064 |
| 1298.0 | 87.138 |
| 1297.0 | 86.985 |
| 1296.0 | 87.141 |
| 1295.0 | 87.016 |
| 1294.0 | 87.073 |
| 1293.0 | 87.126 |
| 1292.0 | 87.126 |
| 1291.0 | 87.035 |
| 1290.0 | 87.123 |
| 1289.0 | 86.985 |
| 1288.0 | 87.024 |
| 1287.0 | 86.948 |
| 1286.0 | 86.839 |
| 1285.0 | 86.957 |
| 1284.0 | 86.675 |
| 1283.0 | 86.623 |
| 1282.0 | 86.432 |
| 1281.0 | 86.479 |
| 1280.0 | 86.331 |
| 1279.0 | 86.165 |
| 1278.0 | 86.031 |
| 1277.0 | 85.918 |
| 1276.0 | 85.725 |
| 1275.0 | 85.606 |
| 1274.0 | 85.412 |
| 1273.0 | 85.245 |
| 1272.0 | 85.147 |
| 1271.0 | 85.02 |
| 1270.0 | 84.745 |
| 1269.0 | 84.555 |
| 1268.0 | 84.311 |
| 1267.0 | 84.211 |
| 1266.0 | 83.914 |
| 1265.0 | 83.814 |
| 1264.0 | 83.607 |
| 1263.0 | 83.259 |
| 1262.0 | 83.078 |
| 1261.0 | 82.824 |
| 1260.0 | 82.651 |
| 1259.0 | 82.386 |
| 1258.0 | 82.146 |
| 1257.0 | 82.082 |
| 1256.0 | 81.781 |
| 1255.0 | 81.476 |
| 1254.0 | 81.293 |
| 1253.0 | 81.09 |
| 1252.0 | 80.732 |
| 1251.0 | 80.528 |
| 1250.0 | 80.331 |
| 1249.0 | 80.224 |
| 1248.0 | 79.88 |
| 1247.0 | 79.679 |
| 1246.0 | 79.417 |
| 1245.0 | 79.31 |
| 1244.0 | 78.996 |
| 1243.0 | 78.791 |
| 1242.0 | 78.613 |
| 1241.0 | 78.402 |
| 1240.0 | 78.198 |
| 1239.0 | 77.99 |
| 1238.0 | 77.733 |
| 1237.0 | 77.6 |
| 1236.0 | 77.387 |
| 1235.0 | 77.112 |
| 1234.0 | 76.982 |
| 1233.0 | 76.718 |
| 1232.0 | 76.594 |
| 1231.0 | 76.536 |
| 1230.0 | 76.259 |
| 1229.0 | 76.173 |
| 1228.0 | 76.045 |
| 1227.0 | 75.814 |
| 1226.0 | 75.692 |
| 1225.0 | 75.586 |
| 1224.0 | 75.412 |
| 1223.0 | 75.331 |
| 1222.0 | 75.269 |
| 1221.0 | 75.151 |
| 1220.0 | 74.965 |
| 1219.0 | 75.008 |
| 1218.0 | 74.75 |
| 1217.0 | 74.75 |
| 1216.0 | 74.656 |
| 1215.0 | 74.564 |
| 1214.0 | 74.632 |
| 1213.0 | 74.488 |
| 1212.0 | 74.46 |
| 1211.0 | 74.392 |
| 1210.0 | 74.435 |
| 1209.0 | 74.435 |
| 1208.0 | 74.338 |
| 1207.0 | 74.356 |
| 1206.0 | 74.378 |
| 1205.0 | 74.401 |
| 1204.0 | 74.426 |
| 1203.0 | 74.458 |
| 1202.0 | 74.444 |
| 1201.0 | 74.509 |
| 1200.0 | 74.599 |
| 1199.0 | 74.652 |
| 1198.0 | 74.669 |
| 1197.0 | 74.671 |
| 1196.0 | 74.864 |
| 1195.0 | 74.933 |
| 1194.0 | 75.04 |
| 1193.0 | 75.099 |
| 1192.0 | 75.232 |
| 1191.0 | 75.312 |
| 1190.0 | 75.454 |
| 1189.0 | 75.606 |
| 1188.0 | 75.672 |
| 1187.0 | 75.966 |
| 1186.0 | 76.165 |
| 1185.0 | 76.234 |
| 1184.0 | 76.432 |
| 1183.0 | 76.529 |
| 1182.0 | 76.772 |
| 1181.0 | 77.04 |
| 1180.0 | 77.242 |
| 1179.0 | 77.344 |
| 1178.0 | 77.601 |
| 1177.0 | 77.751 |
| 1176.0 | 77.979 |
| 1175.0 | 78.185 |
| 1174.0 | 78.459 |
| 1173.0 | 78.7 |
| 1172.0 | 78.855 |
| 1171.0 | 79.126 |
| 1170.0 | 79.36 |
| 1169.0 | 79.579 |
| 1168.0 | 79.825 |
| 1167.0 | 80.009 |
| 1166.0 | 80.222 |
| 1165.0 | 80.506 |
| 1164.0 | 80.775 |
| 1163.0 | 80.902 |
| 1162.0 | 81.067 |
| 1161.0 | 81.291 |
| 1160.0 | 81.564 |
| 1159.0 | 81.737 |
| 1158.0 | 82.086 |
| 1157.0 | 82.182 |
| 1156.0 | 82.5 |
| 1155.0 | 82.739 |
| 1154.0 | 82.91 |
| 1153.0 | 82.999 |
| 1152.0 | 83.342 |
| 1151.0 | 83.481 |
| 1150.0 | 83.757 |
| 1149.0 | 83.942 |
| 1148.0 | 84.02 |
| 1147.0 | 84.291 |
| 1146.0 | 84.446 |
| 1145.0 | 84.574 |
| 1144.0 | 84.757 |
| 1143.0 | 84.935 |
| 1142.0 | 85.06 |
| 1141.0 | 85.268 |
| 1140.0 | 85.406 |
| 1139.0 | 85.425 |
| 1138.0 | 85.607 |
| 1137.0 | 85.674 |
| 1136.0 | 85.682 |
| 1135.0 | 85.845 |
| 1134.0 | 85.901 |
| 1133.0 | 86.024 |
| 1132.0 | 86.046 |
| 1131.0 | 86.125 |
| 1130.0 | 86.143 |
| 1129.0 | 86.27 |
| 1128.0 | 86.236 |
| 1127.0 | 86.251 |
| 1126.0 | 86.353 |
| 1125.0 | 86.238 |
| 1124.0 | 86.385 |
| 1123.0 | 86.352 |
| 1122.0 | 86.239 |
| 1121.0 | 86.262 |
| 1120.0 | 86.283 |
| 1119.0 | 86.226 |
| 1118.0 | 86.081 |
| 1117.0 | 86.011 |
| 1116.0 | 86.027 |
| 1115.0 | 86.023 |
| 1114.0 | 85.857 |
| 1113.0 | 85.743 |
| 1112.0 | 85.724 |
| 1111.0 | 85.559 |
| 1110.0 | 85.448 |
| 1109.0 | 85.425 |
| 1108.0 | 85.306 |
| 1107.0 | 85.246 |
| 1106.0 | 85.149 |
| 1105.0 | 84.917 |
| 1104.0 | 84.833 |
| 1103.0 | 84.843 |
| 1102.0 | 84.623 |
| 1101.0 | 84.502 |
| 1100.0 | 84.416 |
| 1099.0 | 84.264 |
| 1098.0 | 84.134 |
| 1097.0 | 84.068 |
| 1096.0 | 83.91 |
| 1095.0 | 83.804 |
| 1094.0 | 83.605 |
| 1093.0 | 83.596 |
| 1092.0 | 83.46 |
| 1091.0 | 83.428 |
| 1090.0 | 83.242 |
| 1089.0 | 83.085 |
| 1088.0 | 83.009 |
| 1087.0 | 82.925 |
| 1086.0 | 82.855 |
| 1085.0 | 82.765 |
| 1084.0 | 82.686 |
| 1083.0 | 82.549 |
| 1082.0 | 82.563 |
| 1081.0 | 82.527 |
| 1080.0 | 82.34 |
| 1079.0 | 82.375 |
| 1078.0 | 82.277 |
| 1077.0 | 82.157 |
| 1076.0 | 82.217 |
| 1075.0 | 82.138 |
| 1074.0 | 82.055 |
| 1073.0 | 82.103 |
| 1072.0 | 82.069 |
| 1071.0 | 82.039 |
| 1070.0 | 82.005 |
| 1069.0 | 82.053 |
| 1068.0 | 81.99 |
| 1067.0 | 81.948 |
| 1066.0 | 82.042 |
| 1065.0 | 82.043 |
| 1064.0 | 82.089 |
| 1063.0 | 82.072 |
| 1062.0 | 82.137 |
| 1061.0 | 82.169 |
| 1060.0 | 82.166 |
| 1059.0 | 82.142 |
| 1058.0 | 82.242 |
| 1057.0 | 82.358 |
| 1056.0 | 82.389 |
| 1055.0 | 82.435 |
| 1054.0 | 82.467 |
| 1053.0 | 82.602 |
| 1052.0 | 82.695 |
| 1051.0 | 82.802 |
| 1050.0 | 82.867 |
| 1049.0 | 82.924 |
| 1048.0 | 82.928 |
| 1047.0 | 83.029 |
| 1046.0 | 83.161 |
| 1045.0 | 83.286 |
| 1044.0 | 83.406 |
| 1043.0 | 83.442 |
| 1042.0 | 83.516 |
| 1041.0 | 83.625 |
| 1040.0 | 83.797 |
| 1039.0 | 83.938 |
| 1038.0 | 83.976 |
| 1037.0 | 84.161 |
| 1036.0 | 84.124 |
| 1035.0 | 84.341 |
| 1034.0 | 84.402 |
| 1033.0 | 84.489 |
| 1032.0 | 84.557 |
| 1031.0 | 84.713 |
| 1030.0 | 84.713 |
| 1029.0 | 84.752 |
| 1028.0 | 84.833 |
| 1027.0 | 85.049 |
| 1026.0 | 85.14 |
| 1025.0 | 85.306 |
| 1024.0 | 85.171 |
| 1023.0 | 85.392 |
| 1022.0 | 85.463 |
| 1021.0 | 85.52 |
| 1020.0 | 85.564 |
| 1019.0 | 85.631 |
| 1018.0 | 85.64 |
| 1017.0 | 85.645 |
| 1016.0 | 85.847 |
| 1015.0 | 85.848 |
| 1014.0 | 85.889 |
| 1013.0 | 85.913 |
| 1012.0 | 85.871 |
| 1011.0 | 85.945 |
| 1010.0 | 86.014 |
| 1009.0 | 85.993 |
| 1008.0 | 86.107 |
| 1007.0 | 86.053 |
| 1006.0 | 86.129 |
| 1005.0 | 86.183 |
| 1004.0 | 86.053 |
| 1003.0 | 86.054 |
| 1002.0 | 86.081 |
| 1001.0 | 86.141 |
| 1000.0 | 86.118 |
| 999.0 | 86.076 |
| 998.0 | 86.086 |
| 997.0 | 86.134 |
| 996.0 | 86.087 |
| 995.0 | 86.041 |
| 994.0 | 86.042 |
| 993.0 | 86.021 |
| 992.0 | 85.954 |
| 991.0 | 86.044 |
| 990.0 | 85.875 |
| 989.0 | 85.95 |
| 988.0 | 85.883 |
| 987.0 | 85.998 |
| 986.0 | 85.952 |
| 985.0 | 85.781 |
| 984.0 | 85.899 |
| 983.0 | 85.716 |
| 982.0 | 85.659 |
| 981.0 | 85.709 |
| 980.0 | 85.755 |
| 979.0 | 85.649 |
| 978.0 | 85.604 |
| 977.0 | 85.622 |
| 976.0 | 85.615 |
| 975.0 | 85.632 |
| 974.0 | 85.582 |
| 973.0 | 85.544 |
| 972.0 | 85.483 |
| 971.0 | 85.501 |
| 970.0 | 85.462 |
| 969.0 | 85.477 |
| 968.0 | 85.471 |
| 967.0 | 85.457 |
| 966.0 | 85.584 |
| 965.0 | 85.395 |
| 964.0 | 85.439 |
| 963.0 | 85.472 |
| 962.0 | 85.436 |
| 961.0 | 85.408 |
| 960.0 | 85.382 |
| 959.0 | 85.416 |
| 958.0 | 85.389 |
| 957.0 | 85.453 |
| 956.0 | 85.365 |
| 955.0 | 85.456 |
| 954.0 | 85.426 |
| 953.0 | 85.49 |
| 952.0 | 85.5 |
| 951.0 | 85.532 |
| 950.0 | 85.499 |
| 949.0 | 85.414 |
| 948.0 | 85.544 |
| 947.0 | 85.615 |
| 946.0 | 85.612 |
| 945.0 | 85.621 |
| 944.0 | 85.66 |
| 943.0 | 85.8 |
| 942.0 | 85.676 |
| 941.0 | 85.678 |
| 940.0 | 85.774 |
| 939.0 | 85.914 |
| 938.0 | 85.787 |
| 937.0 | 85.893 |
| 936.0 | 85.852 |
| 935.0 | 86.114 |
| 934.0 | 86.083 |
| 933.0 | 86.027 |
| 932.0 | 86.006 |
| 931.0 | 86.136 |
| 930.0 | 86.069 |
| 929.0 | 86.117 |
| 928.0 | 86.223 |
| 927.0 | 86.255 |
| 926.0 | 86.271 |
| 925.0 | 86.284 |
| 924.0 | 86.35 |
| 923.0 | 86.305 |
| 922.0 | 86.357 |
| 921.0 | 86.45 |
| 920.0 | 86.396 |
| 919.0 | 86.354 |
| 918.0 | 86.574 |
| 917.0 | 86.429 |
| 916.0 | 86.574 |
| 915.0 | 86.53 |
| 914.0 | 86.659 |
| 913.0 | 86.74 |
| 912.0 | 86.634 |
| 911.0 | 86.719 |
| 910.0 | 86.732 |
| 909.0 | 86.727 |
| 908.0 | 86.601 |
| 907.0 | 86.688 |
| 906.0 | 86.755 |
| 905.0 | 86.763 |
| 904.0 | 86.728 |
| 903.0 | 86.747 |
| 902.0 | 86.719 |
| 901.0 | 86.673 |
| 900.0 | 86.784 |
| 899.0 | 86.687 |
| 898.0 | 86.611 |
| 897.0 | 86.582 |
| 896.0 | 86.513 |
| 895.0 | 86.565 |
| 894.0 | 86.638 |
| 893.0 | 86.594 |
| 892.0 | 86.539 |
| 891.0 | 86.435 |
| 890.0 | 86.425 |
| 889.0 | 86.376 |
| 888.0 | 86.233 |
| 887.0 | 86.352 |
| 886.0 | 86.191 |
| 885.0 | 86.204 |
| 884.0 | 86.027 |
| 883.0 | 86.003 |
| 882.0 | 85.964 |
| 881.0 | 85.895 |
| 880.0 | 85.93 |
| 879.0 | 85.849 |
| 878.0 | 85.786 |
| 877.0 | 85.706 |
| 876.0 | 85.73 |
| 875.0 | 85.662 |
| 874.0 | 85.534 |
| 873.0 | 85.43 |
| 872.0 | 85.495 |
| 871.0 | 85.322 |
| 870.0 | 85.302 |
| 869.0 | 85.285 |
| 868.0 | 85.249 |
| 867.0 | 85.183 |
| 866.0 | 85.16 |
| 865.0 | 85.141 |
| 864.0 | 85.207 |
| 863.0 | 85.156 |
| 862.0 | 85.158 |
| 861.0 | 85.231 |
| 860.0 | 85.172 |
| 859.0 | 85.229 |
| 858.0 | 85.203 |
| 857.0 | 85.2 |
| 856.0 | 85.252 |
| 855.0 | 85.418 |
| 854.0 | 85.345 |
| 853.0 | 85.389 |
| 852.0 | 85.473 |
| 851.0 | 85.513 |
| 850.0 | 85.687 |
| 849.0 | 85.722 |
| 848.0 | 85.901 |
| 847.0 | 85.899 |
| 846.0 | 86.096 |
| 845.0 | 86.162 |
| 844.0 | 86.165 |
| 843.0 | 86.243 |
| 842.0 | 86.374 |
| 841.0 | 86.581 |
| 840.0 | 86.63 |
| 839.0 | 86.697 |
| 838.0 | 86.759 |
| 837.0 | 86.976 |
| 836.0 | 87.05 |
| 835.0 | 87.114 |
| 834.0 | 87.255 |
| 833.0 | 87.289 |
| 832.0 | 87.365 |
| 831.0 | 87.528 |
| 830.0 | 87.58 |
| 829.0 | 87.66 |
| 828.0 | 87.652 |
| 827.0 | 87.885 |
| 826.0 | 87.823 |
| 825.0 | 87.844 |
| 824.0 | 87.822 |
| 823.0 | 87.852 |
| 822.0 | 87.863 |
| 821.0 | 87.852 |
| 820.0 | 87.862 |
| 819.0 | 87.855 |
| 818.0 | 87.826 |
| 817.0 | 87.861 |
| 816.0 | 87.761 |
| 815.0 | 87.555 |
| 814.0 | 87.518 |
| 813.0 | 87.481 |
| 812.0 | 87.446 |
| 811.0 | 87.272 |
| 810.0 | 87.255 |
| 809.0 | 87.153 |
| 808.0 | 86.973 |
| 807.0 | 86.958 |
| 806.0 | 86.768 |
| 805.0 | 86.651 |
| 804.0 | 86.578 |
| 803.0 | 86.433 |
| 802.0 | 86.445 |
| 801.0 | 86.277 |
| 800.0 | 86.208 |
| 799.0 | 87.058 |
| 798.0 | 87.013 |
| 797.0 | 86.996 |
| 796.0 | 86.866 |
| 795.0 | 86.793 |
| 794.0 | 86.747 |
| 793.0 | 86.781 |
| 792.0 | 86.603 |
| 791.0 | 86.605 |
| 790.0 | 86.579 |
| 789.0 | 86.539 |
| 788.0 | 86.504 |
| 787.0 | 86.5 |
| 786.0 | 86.632 |
| 785.0 | 86.514 |
| 784.0 | 86.539 |
| 783.0 | 86.591 |
| 782.0 | 86.633 |
| 781.0 | 86.695 |
| 780.0 | 86.687 |
| 779.0 | 86.751 |
| 778.0 | 86.715 |
| 777.0 | 86.836 |
| 776.0 | 86.909 |
| 775.0 | 86.938 |
| 774.0 | 86.892 |
| 773.0 | 86.947 |
| 772.0 | 87.048 |
| 771.0 | 87.045 |
| 770.0 | 87.036 |
| 769.0 | 87.073 |
| 768.0 | 87.109 |
| 767.0 | 87.061 |
| 766.0 | 87.133 |
| 765.0 | 87.094 |
| 764.0 | 87.082 |
| 763.0 | 87.017 |
| 762.0 | 86.947 |
| 761.0 | 86.967 |
| 760.0 | 86.883 |
| 759.0 | 86.8 |
| 758.0 | 86.794 |
| 757.0 | 86.656 |
| 756.0 | 86.621 |
| 755.0 | 86.535 |
| 754.0 | 86.423 |
| 753.0 | 86.324 |
| 752.0 | 86.196 |
| 751.0 | 86.119 |
| 750.0 | 86.058 |
| 749.0 | 86.01 |
| 748.0 | 85.926 |
| 747.0 | 85.8 |
| 746.0 | 85.776 |
| 745.0 | 85.721 |
| 744.0 | 85.665 |
| 743.0 | 85.656 |
| 742.0 | 85.567 |
| 741.0 | 85.585 |
| 740.0 | 85.594 |
| 739.0 | 85.564 |
| 738.0 | 85.613 |
| 737.0 | 85.649 |
| 736.0 | 85.659 |
| 735.0 | 85.711 |
| 734.0 | 85.802 |
| 733.0 | 85.87 |
| 732.0 | 85.91 |
| 731.0 | 86.089 |
| 730.0 | 86.152 |
| 729.0 | 86.263 |
| 728.0 | 86.393 |
| 727.0 | 86.456 |
| 726.0 | 86.615 |
| 725.0 | 86.668 |
| 724.0 | 86.808 |
| 723.0 | 86.874 |
| 722.0 | 86.967 |
| 721.0 | 87.113 |
| 720.0 | 87.153 |
| 719.0 | 87.239 |
| 718.0 | 87.36 |
| 717.0 | 87.339 |
| 716.0 | 87.391 |
| 715.0 | 87.466 |
| 714.0 | 87.487 |
| 713.0 | 87.513 |
| 712.0 | 87.518 |
| 711.0 | 87.572 |
| 710.0 | 87.548 |
| 709.0 | 87.555 |
| 708.0 | 87.502 |
| 707.0 | 87.534 |
| 706.0 | 87.547 |
| 705.0 | 87.545 |
| 704.0 | 87.498 |
| 703.0 | 87.524 |
| 702.0 | 87.522 |
| 701.0 | 87.563 |
| 700.0 | 87.587 |
| 699.0 | 87.638 |
| 698.0 | 87.675 |
| 697.0 | 87.72 |
| 696.0 | 87.838 |
| 695.0 | 87.901 |
| 694.0 | 88.016 |
| 693.0 | 88.09 |
| 692.0 | 88.249 |
| 691.0 | 88.411 |
| 690.0 | 88.451 |
| 689.0 | 88.612 |
| 688.0 | 88.758 |
| 687.0 | 88.879 |
| 686.0 | 88.982 |
| 685.0 | 89.127 |
| 684.0 | 89.201 |
| 683.0 | 89.308 |
| 682.0 | 89.334 |
| 681.0 | 89.433 |
| 680.0 | 89.391 |
| 679.0 | 89.401 |
| 678.0 | 89.391 |
| 677.0 | 89.321 |
| 676.0 | 89.2 |
| 675.0 | 89.09 |
| 674.0 | 88.916 |
| 673.0 | 88.737 |
| 672.0 | 88.569 |
| 671.0 | 88.361 |
| 670.0 | 88.152 |
| 669.0 | 87.92 |
| 668.0 | 87.68 |
| 667.0 | 87.483 |
| 666.0 | 87.275 |
| 665.0 | 87.069 |
| 664.0 | 86.86 |
| 663.0 | 86.697 |
| 662.0 | 86.592 |
| 661.0 | 86.503 |
| 660.0 | 86.433 |
| 659.0 | 86.417 |
| 658.0 | 86.431 |
| 657.0 | 86.508 |
| 656.0 | 86.613 |
| 655.0 | 86.779 |
| 654.0 | 86.968 |
| 653.0 | 87.18 |
| 652.0 | 87.486 |
| 651.0 | 87.793 |
| 650.0 | 88.104 |
| 649.0 | 88.458 |
| 648.0 | 88.808 |
| 647.0 | 89.171 |
| 646.0 | 89.52 |
| 645.0 | 89.847 |
| 644.0 | 90.188 |
| 643.0 | 90.445 |
| 642.0 | 90.624 |
| 641.0 | 90.8 |
| 640.0 | 90.969 |
| 639.0 | 90.981 |
| 638.0 | 90.953 |
| 637.0 | 90.84 |
| 636.0 | 90.672 |
| 635.0 | 90.451 |
| 634.0 | 90.155 |
| 633.0 | 89.818 |
| 632.0 | 89.453 |
| 631.0 | 89.047 |
| 630.0 | 88.635 |
| 629.0 | 88.191 |
| 628.0 | 87.8 |
| 627.0 | 87.422 |
| 626.0 | 87.079 |
| 625.0 | 86.775 |
| 624.0 | 86.535 |
| 623.0 | 86.376 |
| 622.0 | 86.253 |
| 621.0 | 86.276 |
| 620.0 | 86.335 |
| 619.0 | 86.5 |
| 618.0 | 86.778 |
| 617.0 | 87.087 |
| 616.0 | 87.503 |
| 615.0 | 87.995 |
| 614.0 | 88.518 |
| 613.0 | 89.063 |
| 612.0 | 89.666 |
| 611.0 | 90.275 |
| 610.0 | 90.818 |
| 609.0 | 91.35 |
| 608.0 | 91.795 |
| 607.0 | 92.169 |
| 606.0 | 92.413 |
| 605.0 | 92.542 |
| 604.0 | 92.516 |
| 603.0 | 92.39 |
| 602.0 | 92.08 |
| 601.0 | 91.634 |
| 600.0 | 91.074 |
| 599.0 | 90.414 |
| 598.0 | 89.605 |
| 597.0 | 88.714 |
| 596.0 | 87.821 |
| 595.0 | 86.938 |
| 594.0 | 86.049 |
| 593.0 | 85.244 |
| 592.0 | 84.45 |
| 591.0 | 83.831 |
| 590.0 | 83.258 |
| 589.0 | 82.849 |
| 588.0 | 82.571 |
| 587.0 | 82.437 |
| 586.0 | 82.446 |
| 585.0 | 82.642 |
| 584.0 | 82.955 |
| 583.0 | 83.394 |
| 582.0 | 84.025 |
| 581.0 | 84.698 |
| 580.0 | 85.475 |
| 579.0 | 86.297 |
| 578.0 | 87.077 |
| 577.0 | 87.924 |
| 576.0 | 88.665 |
| 575.0 | 89.339 |
| 574.0 | 89.866 |
| 573.0 | 90.23 |
| 572.0 | 90.343 |
| 571.0 | 90.27 |
| 570.0 | 90.014 |
| 569.0 | 89.555 |
| 568.0 | 88.911 |
| 567.0 | 88.076 |
| 566.0 | 87.148 |
| 565.0 | 86.143 |
| 564.0 | 85.127 |
| 563.0 | 84.12 |
| 562.0 | 83.154 |
| 561.0 | 82.335 |
| 560.0 | 81.597 |
| 559.0 | 81.044 |
| 558.0 | 80.659 |
| 557.0 | 80.449 |
| 556.0 | 80.456 |
| 555.0 | 80.682 |
| 554.0 | 81.05 |
| 553.0 | 81.693 |
| 552.0 | 82.485 |
| 551.0 | 83.426 |
| 550.0 | 84.46 |
| 549.0 | 85.559 |
| 548.0 | 86.764 |
| 547.0 | 87.927 |
| 546.0 | 89.062 |
| 545.0 | 90.074 |
| 544.0 | 90.96 |
| 543.0 | 91.639 |
| 542.0 | 92.108 |
| 541.0 | 92.354 |
| 540.0 | 92.415 |
| 539.0 | 92.296 |
| 538.0 | 91.918 |
| 537.0 | 91.454 |
| 536.0 | 90.9 |
| 535.0 | 90.301 |
| 534.0 | 89.687 |
| 533.0 | 89.146 |
| 532.0 | 88.677 |
| 531.0 | 88.337 |
| 530.0 | 88.146 |
| 529.0 | 88.053 |
| 528.0 | 88.105 |
| 527.0 | 88.363 |
| 526.0 | 88.693 |
| 525.0 | 89.15 |
| 524.0 | 89.684 |
| 523.0 | 90.195 |
| 522.0 | 90.808 |
| 521.0 | 91.333 |
| 520.0 | 91.842 |
| 519.0 | 92.251 |
| 518.0 | 92.549 |
| 517.0 | 92.598 |
| 516.0 | 92.656 |
| 515.0 | 92.405 |
| 514.0 | 92.115 |
| 513.0 | 91.73 |
| 512.0 | 91.196 |
| 511.0 | 90.581 |
| 510.0 | 89.983 |
| 509.0 | 89.328 |
| 508.0 | 88.694 |
| 507.0 | 88.097 |
| 506.0 | 87.6 |
| 505.0 | 87.169 |
| 504.0 | 86.786 |
| 503.0 | 86.479 |
| 502.0 | 86.298 |
| 501.0 | 86.192 |
| 500.0 | 86.169 |
| 499.0 | 86.181 |
| 498.0 | 86.329 |
| 497.0 | 86.491 |
| 496.0 | 86.693 |
| 495.0 | 86.994 |
| 494.0 | 87.342 |
| 493.0 | 87.717 |
| 492.0 | 88.139 |
| 491.0 | 88.566 |
| 490.0 | 89.026 |
| 489.0 | 89.49 |
| 488.0 | 89.899 |
| 487.0 | 90.234 |
| 486.0 | 90.543 |
| 485.0 | 90.661 |
| 484.0 | 90.67 |
| 483.0 | 90.472 |
| 482.0 | 90.105 |
| 481.0 | 89.592 |
| 480.0 | 88.895 |
| 479.0 | 88.153 |
| 478.0 | 87.416 |
| 477.0 | 86.779 |
| 476.0 | 86.25 |
| 475.0 | 85.956 |
| 474.0 | 85.953 |
| 473.0 | 86.281 |
| 472.0 | 86.844 |
| 471.0 | 87.634 |
| 470.0 | 88.566 |
| 469.0 | 89.498 |
| 468.0 | 90.282 |
| 467.0 | 90.7 |
| 466.0 | 90.705 |
| 465.0 | 90.234 |
| 464.0 | 89.385 |
| 463.0 | 88.178 |
| 462.0 | 86.72 |
| 461.0 | 85.159 |
| 460.0 | 83.525 |
| 459.0 | 81.748 |
| 458.0 | 79.893 |
| 457.0 | 78.176 |
| 456.0 | 76.693 |
| 455.0 | 75.99 |
| 454.0 | 76.719 |
| 453.0 | 79.149 |
| 452.0 | 81.039 |
| 451.0 | 74.932 |
| 450.0 | 55.611 |
| 449.0 | 30.721 |
| 448.0 | 13.075 |
| 447.0 | 4.756 |
| 446.0 | 1.724 |
| 445.0 | 0.657 |
| 444.0 | 0.268 |
| 443.0 | 0.116 |
| 442.0 | 0.053 |
| 441.0 | 0.025 |
| 440.0 | 0.012 |
| 439.0 | 0.006 |
| 438.0 | 0.003 |
| 437.0 | 0.002 |
| 436.0 | 0.001 |
| 435.0 | 0.001 |
| 434.0 | 0.001 |
| 433.0 | 0 |
| 432.0 | 0 |
| 431.0 | 0 |
| 430.0 | 0 |
| 429.0 | 0 |
| 428.0 | 0 |
| 427.0 | 0 |
| 426.0 | 0 |
| 425.0 | 0 |
| 424.0 | 0 |
| 423.0 | 0 |
| 422.0 | 0 |
| 421.0 | 0 |
| 420.0 | 0 |
| 419.0 | 0 |
| 418.0 | 0 |
| 417.0 | 0 |
| 416.0 | 0 |
| 415.0 | 0 |
| 414.0 | 0 |
| 413.0 | 0 |
| 412.0 | 0 |
| 411.0 | 0 |
| 410.0 | 0 |
| 409.0 | 0 |
| 408.0 | 0 |
| 407.0 | 0 |
| 406.0 | 0 |
| 405.0 | 0 |
| 404.0 | 0 |
| 403.0 | 0 |
| 402.0 | 0 |
| 401.0 | 0 |
| 400.0 | 0 |
| 399.0 | 0 |
| 398.0 | 0 |
| 397.0 | 0 |
| 396.0 | 0 |
| 395.0 | 0 |
| 394.0 | 0 |
| 393.0 | 0 |
| 392.0 | 0 |
| 391.0 | 0 |
| 390.0 | 0 |
| 389.0 | 0 |
| 388.0 | 0 |
| 387.0 | 0 |
| 386.0 | 0 |
| 385.0 | 0 |
| 384.0 | 0 |
| 383.0 | 0 |
| 382.0 | 0 |
| 381.0 | 0 |
| 380.0 | 0 |
| 379.0 | 0 |
| 378.0 | 0 |
| 377.0 | 0 |
| 376.0 | 0 |
| 375.0 | 0 |
| 374.0 | 0 |
| 373.0 | 0 |
| 372.0 | 0 |
| 371.0 | 0 |
| 370.0 | 0 |
| 369.0 | 0 |
| 368.0 | 0 |
| 367.0 | 0 |
| 366.0 | 0 |
| 365.0 | 0 |
| 364.0 | 0 |
| 363.0 | 0 |
| 362.0 | 0 |
| 361.0 | 0 |
| 360.0 | 0 |
| 359.0 | 0 |
| 358.0 | 0 |
| 357.0 | 0 |
| 356.0 | 0 |
| 355.0 | 0 |
| 354.0 | 0 |
| 353.0 | 0 |
| 352.0 | 0 |
| 351.0 | 0 |
| 350.0 | 0 |
| 349.0 | 0 |
| 348.0 | 0 |
| 347.0 | 0 |
| 346.0 | 0 |
| 345.0 | 0 |
| 344.0 | 0 |
| 343.0 | 0 |
| 342.0 | 0 |
| 341.0 | 0 |
| 340.0 | 0 |
| 339.0 | 0 |
| 338.0 | 0 |
| 337.0 | 0 |
| 336.0 | 0 |
| 335.0 | 0 |
| 334.0 | 0 |
| 333.0 | 0 |
| 332.0 | 0 |
| 331.0 | 0 |
| 330.0 | 0 |
| 329.0 | 0 |
| 328.0 | 0 |
| 327.0 | 0 |
| 326.0 | 0 |
| 325.0 | 0 |
| 324.0 | 0 |
| 323.0 | 0 |
| 322.0 | 0 |
| 321.0 | 0 |
| 320.0 | 0 |
| 319.0 | 0 |
| 318.0 | 0 |
| 317.0 | 0 |
| 316.0 | 0 |
| 315.0 | 0 |
| 314.0 | 0 |
| 313.0 | 0 |
| 312.0 | 0 |
| 311.0 | 0 |
| 310.0 | 0 |
| 309.0 | 0 |
| 308.0 | 0 |
| 307.0 | 0 |
| 306.0 | 0 |
| 305.0 | 0 |
| 304.0 | 0 |
| 303.0 | 0 |
| 302.0 | 0 |
| 301.0 | 0 |
| 300.0 | 0 |
| 299.0 | 0 |
| 298.0 | 0 |
| 297.0 | 0 |
| 296.0 | 0 |
| 295.0 | 0 |
| 294.0 | 0 |
| 293.0 | 0 |
| 292.0 | 0 |
| 291.0 | 0 |
| 290.0 | 0 |
| 289.0 | 0 |
| 288.0 | 0 |
| 287.0 | 0 |
| 286.0 | 0 |
| 285.0 | 0 |
| 284.0 | 0 |
| 283.0 | 0 |
| 282.0 | 0 |
| 281.0 | 0 |
| 280.0 | 0 |
| 279.0 | 0 |
| 278.0 | 0 |
| 277.0 | 0 |
| 276.0 | 0 |
| 275.0 | 0 |
| 274.0 | 0 |
| 273.0 | 0 |
| 272.0 | 0 |
| 271.0 | 0 |
| 270.0 | 0 |
| 269.0 | 0 |
| 268.0 | 0 |
| 267.0 | 0 |
| 266.0 | 0 |
| 265.0 | 0 |
| 264.0 | 0 |
| 263.0 | 0 |
| 262.0 | 0 |
| 261.0 | 0 |
| 260.0 | 0 |
| 259.0 | 0.001 |
| 258.0 | 0.001 |
| 257.0 | 0.001 |
| 256.0 | 0.001 |
| 255.0 | 0.001 |
| 254.0 | 0.001 |
| 253.0 | 0.001 |
| 252.0 | 0.001 |
| 251.0 | 0.001 |
| 250.0 | 0.001 |
| 249.0 | 0.001 |
| 248.0 | 0.001 |
| 247.0 | 0.001 |
| 246.0 | 0.001 |
| 245.0 | 0.001 |
| 244.0 | 0.001 |
| 243.0 | 0.001 |
| 242.0 | 0.001 |
| 241.0 | 0.001 |
| 240.0 | 0.001 |
| 239.0 | 0.001 |
| 238.0 | 0.001 |
| 237.0 | 0.001 |
| 236.0 | 0.001 |
| 235.0 | 0.001 |
| 234.0 | 0.001 |
| 233.0 | 0.001 |
| 232.0 | 0.001 |
| 231.0 | 0.001 |
| 230.0 | 0.001 |
| 229.0 | 0.001 |
| 228.0 | 0.001 |
| 227.0 | 0.001 |
| 226.0 | 0.001 |
| 225.0 | 0.001 |
| 224.0 | 0.001 |
| 223.0 | 0.001 |
| 222.0 | 0.001 |
| 221.0 | 0.001 |
| 220.0 | 0.002 |
| 219.0 | 0.002 |
| 218.0 | 0.002 |
| 217.0 | 0.002 |
| 216.0 | 0.002 |
| 215.0 | 0.002 |
| 214.0 | 0.002 |
| 213.0 | 0.002 |
| 212.0 | 0.002 |
| 211.0 | 0.002 |
| 210.0 | 0.002 |
| 209.0 | 0.002 |
| 208.0 | 0.002 |
| 207.0 | 0.003 |
| 206.0 | 0.003 |
| 205.0 | 0.003 |
| 204.0 | 0.003 |
| 203.0 | 0.003 |
| 202.0 | 0.003 |
| 201.0 | 0.003 |
| 200.0 | 0.003 |